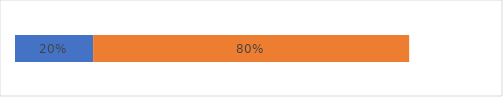
| Category | Так | Ні  |
|---|---|---|
| 0 | 0.198 | 0.802 |